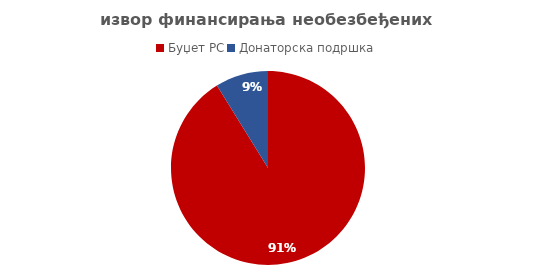
| Category | Series 0 |
|---|---|
| Буџет РС | 962222.912 |
| Донаторска подршка | 93107.665 |